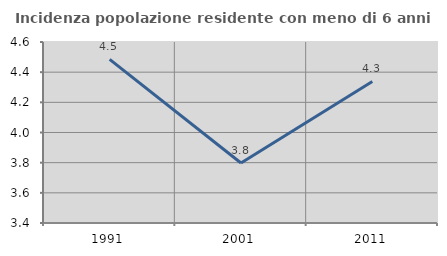
| Category | Incidenza popolazione residente con meno di 6 anni |
|---|---|
| 1991.0 | 4.485 |
| 2001.0 | 3.797 |
| 2011.0 | 4.338 |